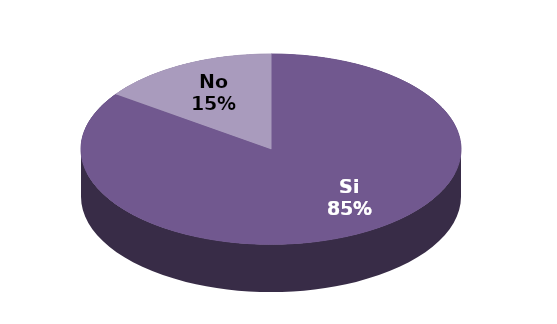
| Category | Series 1 |
|---|---|
| Si | 39 |
| No | 7 |